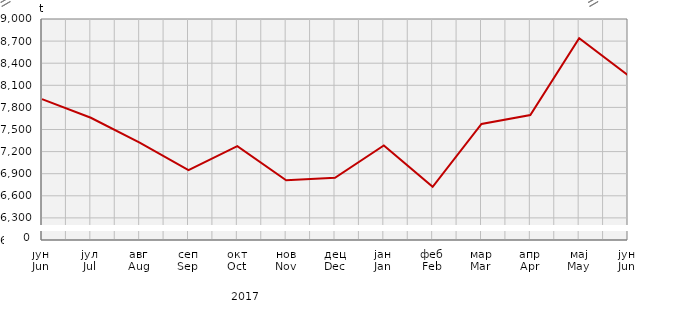
| Category | Прикупљање крављег млијека
Collecting of cow’s milk |
|---|---|
| јун
Jun | 7912.4 |
| јул
Jul | 7659 |
| авг
Aug | 7323 |
| сеп
Sep | 6949.6 |
| окт
Oct | 7275 |
| нов
Nov | 6810.8 |
| дец
Dec | 6844 |
| јан
Jan | 7283.5 |
| феб
Feb | 6721.8 |
| мар
Mar | 7575.8 |
| апр
Apr | 7695.5 |
| мај
May | 8737.947 |
| јун
Jun | 8235.2 |